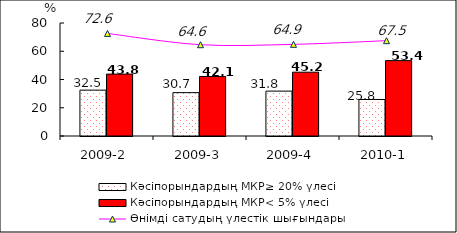
| Category | Кәсіпорындардың МКР≥ 20% үлесі | Кәсіпорындардың МКР< 5% үлесі |
|---|---|---|
| 2009-2 | 32.473 | 43.827 |
| 2009-3 | 30.697 | 42.088 |
| 2009-4 | 31.779 | 45.172 |
| 2010-1 | 25.83 | 53.358 |